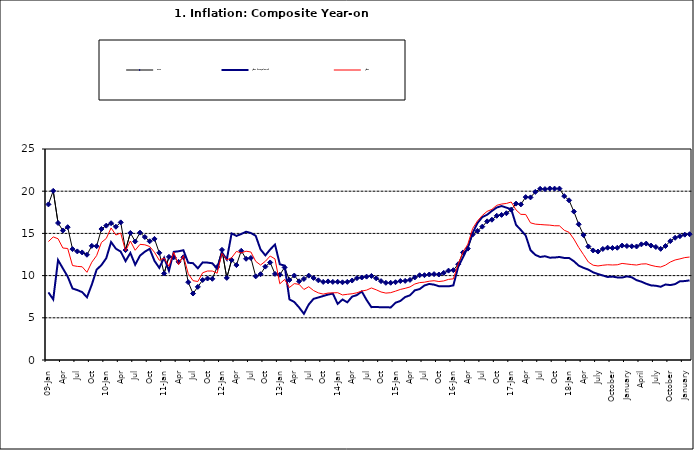
| Category | Food | All Items less Farm Produce | All Items |
|---|---|---|---|
| 09-Jan | 18.436 | 8.013 | 14.034 |
| Feb | 20.041 | 7.178 | 14.584 |
| Mar | 16.233 | 11.842 | 14.366 |
| Apr | 15.342 | 10.85 | 13.268 |
| May | 15.74 | 9.88 | 13.212 |
| June | 13.138 | 8.472 | 11.194 |
| Jul | 12.867 | 8.285 | 11.09 |
| Aug | 12.746 | 8.044 | 11.046 |
| Sep | 12.472 | 7.431 | 10.39 |
| Oct | 13.524 | 8.933 | 11.588 |
| Nov | 13.482 | 10.702 | 12.368 |
| Dec | 15.518 | 11.249 | 13.93 |
| 10-Jan | 15.918 | 12.063 | 14.398 |
| Feb | 16.208 | 13.978 | 15.649 |
| Mar | 15.79 | 13.184 | 14.812 |
| Apr | 16.306 | 12.844 | 15.044 |
| May | 13.023 | 11.711 | 12.915 |
| Jun | 15.053 | 12.686 | 14.099 |
| Jul | 14.043 | 11.287 | 13.002 |
| Aug | 15.09 | 12.366 | 13.702 |
| Sep | 14.57 | 12.83 | 13.65 |
| Oct | 14.065 | 13.168 | 13.45 |
| Nov | 14.351 | 11.746 | 12.766 |
| Dec | 12.701 | 10.917 | 11.815 |
| 11-Jan | 10.255 | 12.118 | 12.08 |
| Feb | 12.221 | 10.569 | 11.1 |
| Mar | 12.169 | 12.815 | 12.779 |
| Apr | 11.629 | 12.882 | 11.291 |
| May | 12.179 | 13.006 | 12.352 |
| Jun | 9.22 | 11.524 | 10.23 |
| Jul | 7.877 | 11.472 | 9.397 |
| Aug | 8.665 | 10.863 | 9.301 |
| Sep | 9.479 | 11.567 | 10.339 |
| Oct | 9.656 | 11.539 | 10.544 |
| Nov | 9.623 | 11.459 | 10.54 |
| Dec | 11.02 | 10.822 | 10.283 |
| 12-Jan | 13.053 | 12.748 | 12.626 |
| 12-Feb | 9.729 | 11.901 | 11.866 |
| 12-Mar | 11.848 | 14.995 | 12.111 |
| Apr | 11.246 | 14.703 | 12.866 |
| May | 12.942 | 14.926 | 12.688 |
| Jun | 11.991 | 15.199 | 12.892 |
| Jul | 12.093 | 15.045 | 12.797 |
| Aug | 9.91 | 14.714 | 11.689 |
| Sep | 10.164 | 13.101 | 11.253 |
| Oct | 11.064 | 12.398 | 11.693 |
| Nov | 11.553 | 13.092 | 12.32 |
| Dec | 10.199 | 13.685 | 11.981 |
| 13-Jan | 10.106 | 11.342 | 9.031 |
| Feb | 10.973 | 11.184 | 9.542 |
| Mar | 9.482 | 7.179 | 8.593 |
| Apr | 10.006 | 6.874 | 9.052 |
| May | 9.321 | 6.227 | 8.964 |
| Jun | 9.606 | 5.472 | 8.353 |
| Jul | 9.994 | 6.58 | 8.682 |
| Aug | 9.723 | 7.245 | 8.231 |
| Sep | 9.437 | 7.41 | 7.952 |
| Oct | 9.249 | 7.579 | 7.807 |
| Nov | 9.313 | 7.75 | 7.931 |
| Dec | 9.253 | 7.872 | 7.957 |
| 14-Jan | 9.271 | 6.648 | 7.977 |
| Feb | 9.207 | 7.166 | 7.707 |
| Mar | 9.254 | 6.836 | 7.783 |
| Apr | 9.414 | 7.508 | 7.851 |
| May | 9.698 | 7.693 | 7.965 |
| Jun | 9.776 | 8.122 | 8.167 |
| Jul | 9.878 | 7.116 | 8.281 |
| Aug | 9.959 | 6.264 | 8.534 |
| Sep | 9.676 | 6.278 | 8.317 |
| Oct | 9.343 | 6.252 | 8.06 |
| Nov | 9.144 | 6.255 | 7.927 |
| Dec | 9.152 | 6.225 | 7.978 |
| 15-Jan | 9.215 | 6.787 | 8.157 |
| Feb | 9.359 | 6.994 | 8.359 |
| Mar | 9.376 | 7.46 | 8.494 |
| Apr | 9.49 | 7.661 | 8.655 |
| May | 9.782 | 8.253 | 9.003 |
| Jun | 10.041 | 8.403 | 9.168 |
| Jul | 10.049 | 8.83 | 9.218 |
| Aug | 10.131 | 9.01 | 9.336 |
| Sep | 10.174 | 8.928 | 9.394 |
| Oct | 10.129 | 8.742 | 9.296 |
| Nov | 10.321 | 8.732 | 9.368 |
| Dec | 10.588 | 8.727 | 9.554 |
| 16-Jan | 10.642 | 8.841 | 9.617 |
| Feb | 11.348 | 11.041 | 11.379 |
| Mar | 12.745 | 12.17 | 12.775 |
| Apr | 13.194 | 13.352 | 13.721 |
| May | 14.861 | 15.054 | 15.577 |
| Jun | 15.302 | 16.224 | 16.48 |
| Jul | 15.799 | 16.929 | 17.127 |
| Aug | 16.427 | 17.208 | 17.609 |
| Sep | 16.622 | 17.666 | 17.852 |
| Oct | 17.09 | 18.067 | 18.33 |
| Nov | 17.191 | 18.241 | 18.476 |
| Dec | 17.388 | 18.052 | 18.547 |
| 17-Jan | 17.818 | 17.867 | 18.719 |
| Feb | 18.528 | 16.011 | 17.78 |
| Mar | 18.436 | 15.404 | 17.256 |
| Apr | 19.303 | 14.75 | 17.244 |
| May | 19.266 | 13.016 | 16.251 |
| Jun | 19.915 | 12.455 | 16.098 |
| Jul | 20.284 | 12.207 | 16.053 |
| Aug | 20.251 | 12.296 | 16.012 |
| Sep | 20.321 | 12.123 | 15.979 |
| Oct | 20.306 | 12.142 | 15.905 |
| Nov | 20.308 | 12.206 | 15.901 |
| Dec | 19.415 | 12.089 | 15.372 |
| 18-Jan | 18.919 | 12.09 | 15.127 |
| Feb | 17.588 | 11.707 | 14.33 |
| Mar | 16.08 | 11.181 | 13.337 |
| Apr | 14.799 | 10.92 | 12.482 |
| May | 13.448 | 10.71 | 11.608 |
| June | 12.977 | 10.387 | 11.231 |
| July | 12.85 | 10.183 | 11.142 |
| August | 13.158 | 10.015 | 11.227 |
| September | 13.309 | 9.838 | 11.284 |
| October | 13.277 | 9.882 | 11.259 |
| November | 13.301 | 9.787 | 11.281 |
| December | 13.559 | 9.771 | 11.442 |
| January | 13.505 | 9.91 | 11.374 |
| February | 13.473 | 9.8 | 11.306 |
| March | 13.451 | 9.461 | 11.251 |
| April | 13.701 | 9.28 | 11.372 |
| May | 13.794 | 9.033 | 11.396 |
| June | 13.558 | 8.841 | 11.217 |
| July | 13.392 | 8.798 | 11.084 |
| August | 13.17 | 8.678 | 11.016 |
| September | 13.507 | 8.945 | 11.244 |
| October | 14.088 | 8.876 | 11.607 |
| November | 14.482 | 8.993 | 11.854 |
| December | 14.667 | 9.331 | 11.982 |
| January | 14.849 | 9.349 | 12.132 |
| February | 14.904 | 9.434 | 12.199 |